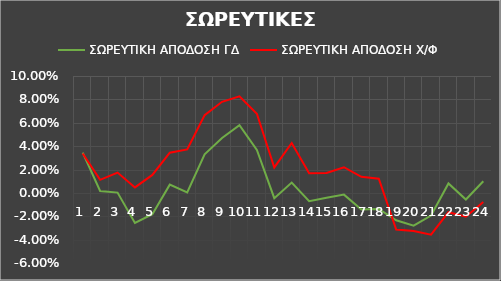
| Category | ΣΩΡΕΥΤΙΚΗ ΑΠΟΔΟΣΗ ΓΔ | ΣΩΡΕΥΤΙΚΗ ΑΠΟΔΟΣΗ Χ/Φ |
|---|---|---|
| 0 | 0.034 | 0.034 |
| 1 | 0.002 | 0.011 |
| 2 | 0 | 0.017 |
| 3 | -0.026 | 0.005 |
| 4 | -0.018 | 0.015 |
| 5 | 0.007 | 0.034 |
| 6 | 0 | 0.037 |
| 7 | 0.033 | 0.067 |
| 8 | 0.047 | 0.078 |
| 9 | 0.058 | 0.083 |
| 10 | 0.037 | 0.068 |
| 11 | -0.005 | 0.022 |
| 12 | 0.009 | 0.043 |
| 13 | -0.007 | 0.017 |
| 14 | -0.004 | 0.017 |
| 15 | -0.002 | 0.022 |
| 16 | -0.014 | 0.014 |
| 17 | -0.014 | 0.012 |
| 18 | -0.023 | -0.031 |
| 19 | -0.028 | -0.033 |
| 20 | -0.019 | -0.036 |
| 21 | 0.008 | -0.017 |
| 22 | -0.006 | -0.02 |
| 23 | 0.01 | -0.008 |